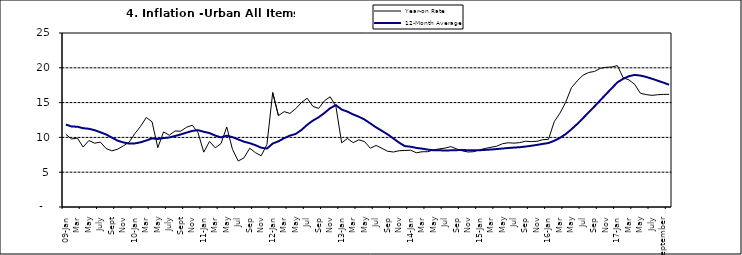
| Category | Year-on Rate | 12-Month Average |
|---|---|---|
| 09-Jan | 10.439 | 11.844 |
| Feb | 9.772 | 11.562 |
| Mar | 9.907 | 11.538 |
| Apr | 8.618 | 11.319 |
| May | 9.547 | 11.246 |
| June | 9.17 | 11.039 |
| July | 9.325 | 10.738 |
| Aug | 8.401 | 10.424 |
| Sept | 8.07 | 9.973 |
| Oct | 8.3 | 9.535 |
| Nov | 8.781 | 9.278 |
| Dec | 9.298 | 9.117 |
| 10-Jan | 10.534 | 9.136 |
| Feb | 11.584 | 9.297 |
| Mar | 12.864 | 9.555 |
| Apr | 12.24 | 9.859 |
| May | 8.524 | 9.769 |
| June | 10.781 | 9.904 |
| July | 10.313 | 9.987 |
| Aug | 10.924 | 10.197 |
| Sept | 10.891 | 10.43 |
| Oct | 11.457 | 10.689 |
| Nov | 11.748 | 10.932 |
| Dec | 10.699 | 11.042 |
| 11-Jan | 7.878 | 10.806 |
| Feb | 9.426 | 10.623 |
| Mar | 8.498 | 10.26 |
| Apr | 9.11 | 10.005 |
| May | 11.5 | 10.249 |
| Jun | 8.278 | 10.034 |
| Jul | 6.608 | 9.711 |
| Aug | 7.061 | 9.38 |
| Sep | 8.443 | 9.178 |
| Oct | 7.802 | 8.88 |
| Nov | 7.365 | 8.525 |
| Dec | 8.993 | 8.395 |
| 12-Jan | 16.445 | 9.119 |
| Feb | 13.123 | 9.443 |
| Mar | 13.701 | 9.889 |
| Apr | 13.447 | 10.259 |
| May | 14.127 | 10.496 |
| Jun | 15.012 | 11.062 |
| Jul | 15.63 | 11.81 |
| Aug | 14.456 | 12.422 |
| Sep | 14.162 | 12.893 |
| Oct | 15.26 | 13.506 |
| Nov | 15.836 | 14.199 |
| Dec | 14.459 | 14.637 |
| 13-Jan | 9.22 | 14.006 |
| Feb | 9.85 | 13.703 |
| Mar | 9.253 | 13.302 |
| Apr | 9.657 | 12.966 |
| May | 9.385 | 12.557 |
| Jun | 8.441 | 11.999 |
| Jul | 8.849 | 11.443 |
| Aug | 8.431 | 10.946 |
| Sep | 8.013 | 10.44 |
| Oct | 7.9 | 9.849 |
| Nov | 8.086 | 9.245 |
| Dec | 8.117 | 8.75 |
| 14-Jan | 8.164 | 8.662 |
| Feb | 7.791 | 8.493 |
| Mar | 7.937 | 8.384 |
| Apr | 7.947 | 8.246 |
| May | 8.195 | 8.151 |
| Jun | 8.358 | 8.146 |
| Jul | 8.464 | 8.118 |
| Aug | 8.673 | 8.141 |
| Sep | 8.357 | 8.17 |
| Oct | 8.064 | 8.182 |
| Nov | 7.902 | 8.165 |
| Dec | 7.948 | 8.151 |
| 15-Jan | 8.211 | 8.155 |
| Feb | 8.412 | 8.206 |
| Mar | 8.579 | 8.26 |
| Apr | 8.742 | 8.326 |
| May | 9.092 | 8.403 |
| Jun | 9.232 | 8.478 |
| Jul | 9.177 | 8.54 |
| Aug | 9.25 | 8.591 |
| Sep | 9.455 | 8.684 |
| Oct | 9.398 | 8.795 |
| Nov | 9.442 | 8.922 |
| Dec | 9.665 | 9.064 |
| 16-Jan | 9.728 | 9.19 |
| Feb | 12.254 | 9.516 |
| Mar | 13.485 | 9.935 |
| Apr | 15.052 | 10.474 |
| May | 17.148 | 11.165 |
| Jun | 18.111 | 11.925 |
| Jul | 18.927 | 12.754 |
| Aug | 19.325 | 13.605 |
| Sep | 19.476 | 14.444 |
| Oct | 19.914 | 15.318 |
| Nov | 20.067 | 16.193 |
| Dec | 20.118 | 17.05 |
| 17-Jan | 20.315 | 17.914 |
| Feb | 18.569 | 18.418 |
| Mar | 18.27 | 18.794 |
| Apr | 17.621 | 18.982 |
| May | 16.343 | 18.883 |
| June | 16.153 | 18.692 |
| July | 16.038 | 18.43 |
| August | 16.128 | 18.151 |
| September | 16.183 | 17.872 |
| October | 16.187 | 17.567 |